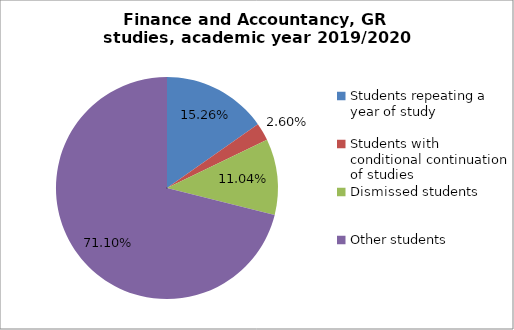
| Category | Series 0 |
|---|---|
| Students repeating a year of study | 47 |
| Students with conditional continuation of studies | 8 |
| Dismissed students | 34 |
| Other students | 219 |